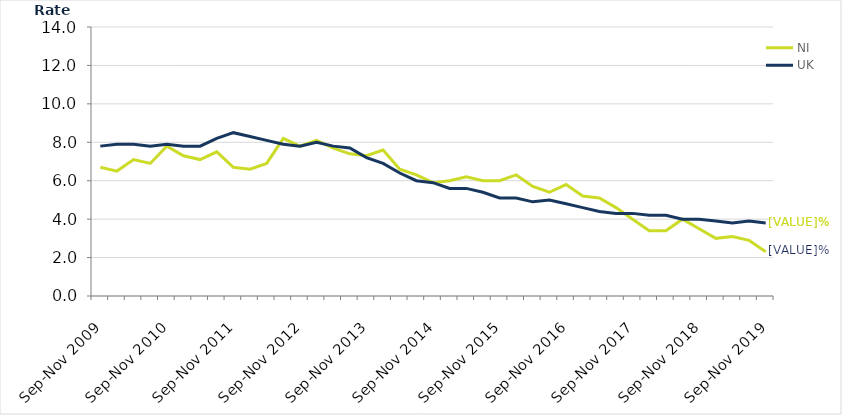
| Category | NI | UK |
|---|---|---|
| Sep-Nov 2009 | 6.7 | 7.8 |
| Dec-Feb 2010 | 6.5 | 7.9 |
| Mar-May 2010 | 7.1 | 7.9 |
| Jun-Aug 2010 | 6.9 | 7.8 |
| Sep-Nov 2010 | 7.8 | 7.9 |
| Dec-Feb 2011 | 7.3 | 7.8 |
| Mar-May 2011 | 7.1 | 7.8 |
| Jun-Aug 2011 | 7.5 | 8.2 |
| Sep-Nov 2011 | 6.7 | 8.5 |
| Dec-Feb 2012 | 6.6 | 8.3 |
| Mar-May 2012 | 6.9 | 8.1 |
| Jun-Aug 2012 | 8.2 | 7.9 |
| Sep-Nov 2012 | 7.8 | 7.8 |
| Dec-Feb 2013 | 8.1 | 8 |
| Mar-May 2013 | 7.7 | 7.8 |
| Jun-Aug 2013 | 7.4 | 7.7 |
| Sep-Nov 2013 | 7.3 | 7.2 |
| Dec-Feb 2014 | 7.6 | 6.9 |
| Mar-May 2014 | 6.6 | 6.4 |
| Jun-Aug 2014 | 6.3 | 6 |
| Sep-Nov 2014 | 5.9 | 5.9 |
| Dec-Feb 2015 | 6 | 5.6 |
| Mar-May 2015 | 6.2 | 5.6 |
| Jun-Aug 2015 | 6 | 5.4 |
| Sep-Nov 2015 | 6 | 5.1 |
| Dec-Feb 2016 | 6.3 | 5.1 |
| Mar-May 2016 | 5.7 | 4.9 |
| Jun-Aug 2016 | 5.4 | 5 |
| Sep-Nov 2016 | 5.8 | 4.8 |
| Dec-Feb 2017 | 5.2 | 4.6 |
| Mar-May 2017 | 5.1 | 4.4 |
| Jun-Aug 2017 | 4.6 | 4.3 |
| Sep-Nov 2017 | 4 | 4.3 |
| Dec-Feb 2018 | 3.4 | 4.2 |
| Mar-May 2018 | 3.4 | 4.2 |
| Jun-Aug 2018 | 4 | 4 |
| Sep-Nov 2018 | 3.5 | 4 |
| Dec-Feb 2019 | 3 | 3.9 |
| Mar-May 2019 | 3.1 | 3.8 |
| Jun-Aug 2019 | 2.9 | 3.9 |
| Sep-Nov 2019 | 2.3 | 3.8 |